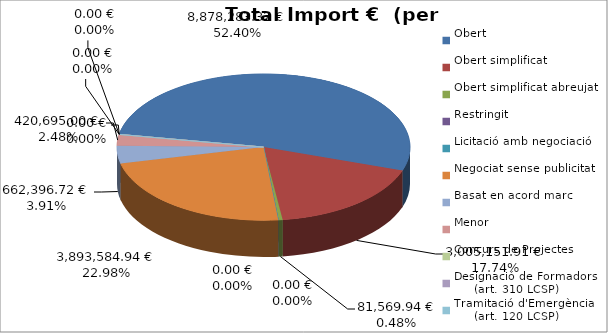
| Category | Total preu
(amb IVA) |
|---|---|
| Obert | 8878283.318 |
| Obert simplificat | 3005151.91 |
| Obert simplificat abreujat | 81569.936 |
| Restringit | 0 |
| Licitació amb negociació | 0 |
| Negociat sense publicitat | 3893584.936 |
| Basat en acord marc | 662396.717 |
| Menor | 420695 |
| Concurs de Projectes | 0 |
| Designació de Formadors
     (art. 310 LCSP) | 0 |
| Tramitació d'Emergència
     (art. 120 LCSP) | 0 |